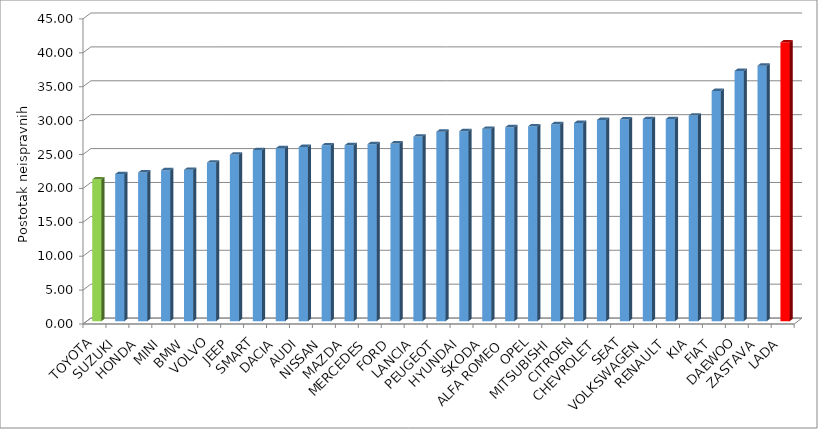
| Category | Series 4 |
|---|---|
| TOYOTA | 20.926 |
| SUZUKI | 21.704 |
| HONDA | 21.935 |
| MINI | 22.281 |
| BMW | 22.33 |
| VOLVO | 23.402 |
| JEEP | 24.572 |
| SMART | 25.247 |
| DACIA | 25.517 |
| AUDI | 25.701 |
| NISSAN | 25.943 |
| MAZDA | 25.954 |
| MERCEDES | 26.109 |
| FORD | 26.216 |
| LANCIA | 27.225 |
| PEUGEOT | 27.952 |
| HYUNDAI | 28.033 |
| ŠKODA | 28.37 |
| ALFA ROMEO | 28.612 |
| OPEL | 28.753 |
| MITSUBISHI | 29.064 |
| CITROEN | 29.237 |
| CHEVROLET | 29.688 |
| SEAT | 29.785 |
| VOLKSWAGEN | 29.811 |
| RENAULT | 29.818 |
| KIA | 30.332 |
| FIAT | 33.973 |
| DAEWOO | 36.924 |
| ZASTAVA | 37.696 |
| LADA | 41.131 |